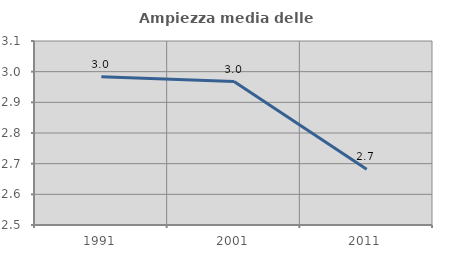
| Category | Ampiezza media delle famiglie |
|---|---|
| 1991.0 | 2.983 |
| 2001.0 | 2.968 |
| 2011.0 | 2.682 |